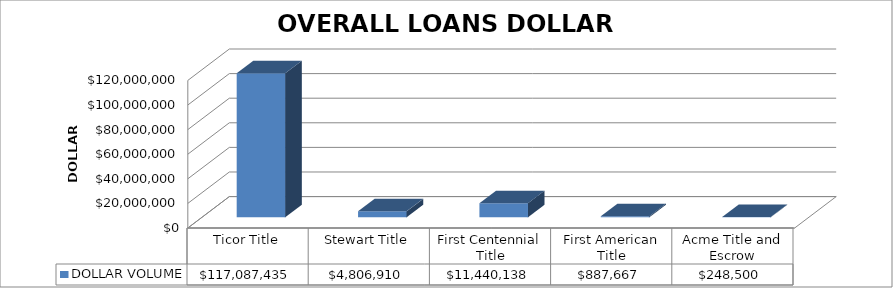
| Category | DOLLAR VOLUME |
|---|---|
| Ticor Title | 117087435 |
| Stewart Title | 4806910 |
| First Centennial Title | 11440138 |
| First American Title | 887667 |
| Acme Title and Escrow | 248500 |